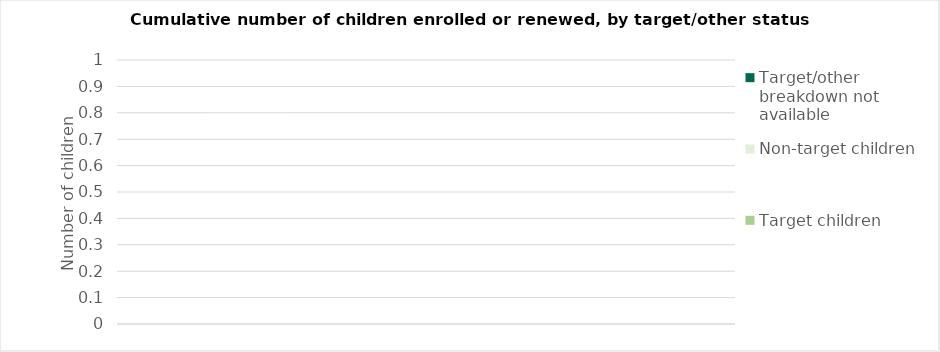
| Category | Target children | Non-target children | Target/other breakdown not available |
|---|---|---|---|
|  | 0 | 0 | 0 |
|  | 0 | 0 | 0 |
|  | 0 | 0 | 0 |
|  | 0 | 0 | 0 |
|  | 0 | 0 | 0 |
|  | 0 | 0 | 0 |
|  | 0 | 0 | 0 |
|  | 0 | 0 | 0 |
|  | 0 | 0 | 0 |
|  | 0 | 0 | 0 |
|  | 0 | 0 | 0 |
|  | 0 | 0 | 0 |
|  | 0 | 0 | 0 |